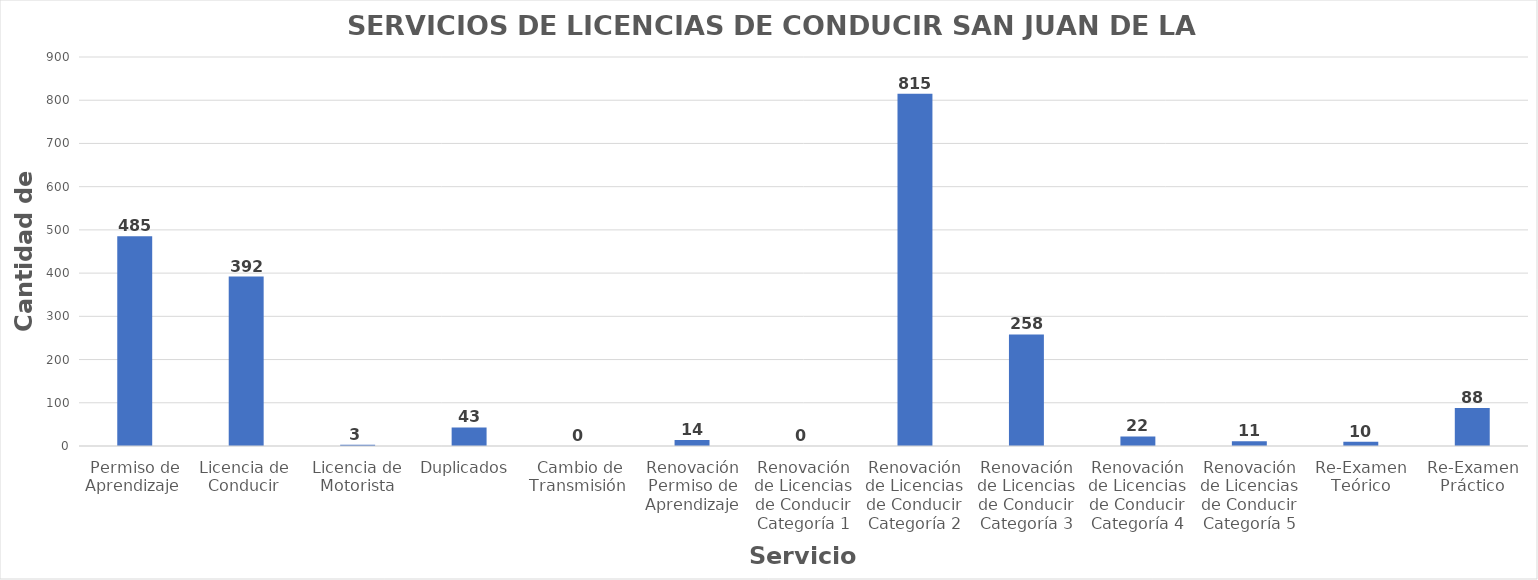
| Category | Series 0 |
|---|---|
| Permiso de Aprendizaje  | 485 |
| Licencia de  Conducir  | 392 |
| Licencia de Motorista | 3 |
| Duplicados  | 43 |
| Cambio de Transmisión  | 0 |
| Renovación Permiso de Aprendizaje | 14 |
| Renovación de Licencias de Conducir Categoría 1 | 0 |
| Renovación de Licencias de Conducir Categoría 2 | 815 |
| Renovación de Licencias de Conducir Categoría 3 | 258 |
| Renovación de Licencias de Conducir Categoría 4 | 22 |
| Renovación de Licencias de Conducir Categoría 5 | 11 |
| Re-Examen Teórico | 10 |
| Re-Examen Práctico | 88 |